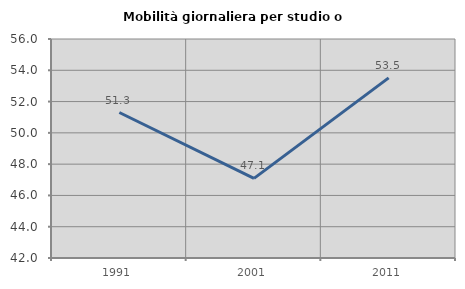
| Category | Mobilità giornaliera per studio o lavoro |
|---|---|
| 1991.0 | 51.3 |
| 2001.0 | 47.088 |
| 2011.0 | 53.514 |